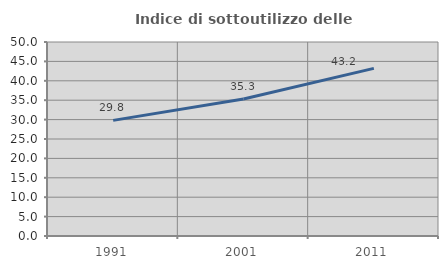
| Category | Indice di sottoutilizzo delle abitazioni  |
|---|---|
| 1991.0 | 29.796 |
| 2001.0 | 35.314 |
| 2011.0 | 43.206 |